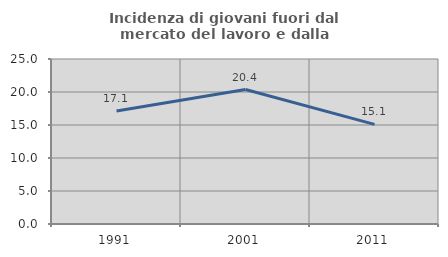
| Category | Incidenza di giovani fuori dal mercato del lavoro e dalla formazione  |
|---|---|
| 1991.0 | 17.123 |
| 2001.0 | 20.373 |
| 2011.0 | 15.097 |